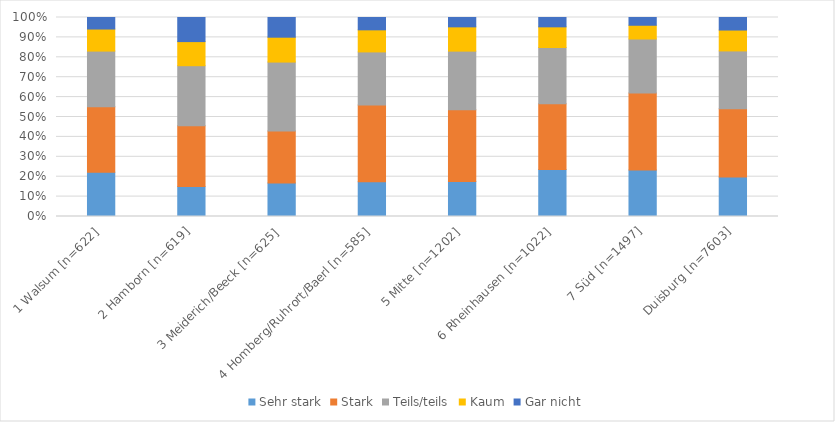
| Category | Sehr stark | Stark | Teils/teils | Kaum | Gar nicht |
|---|---|---|---|---|---|
| 1 Walsum [n=622] | 0.222 | 0.33 | 0.28 | 0.111 | 0.058 |
| 2 Hamborn [n=619] | 0.15 | 0.305 | 0.302 | 0.121 | 0.121 |
| 3 Meiderich/Beeck [n=625] | 0.168 | 0.262 | 0.346 | 0.125 | 0.099 |
| 4 Homberg/Ruhrort/Baerl [n=585] | 0.174 | 0.386 | 0.267 | 0.111 | 0.062 |
| 5 Mitte [n=1202] | 0.176 | 0.361 | 0.294 | 0.122 | 0.047 |
| 6 Rheinhausen [n=1022] | 0.237 | 0.33 | 0.283 | 0.104 | 0.047 |
| 7 Süd [n=1497] | 0.234 | 0.387 | 0.271 | 0.069 | 0.039 |
| Duisburg [n=7603] | 0.199 | 0.343 | 0.29 | 0.105 | 0.063 |